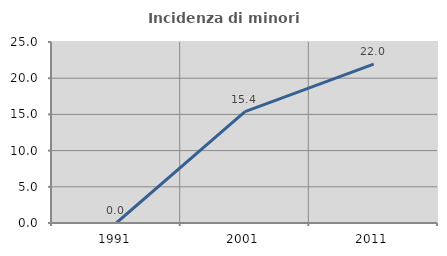
| Category | Incidenza di minori stranieri |
|---|---|
| 1991.0 | 0 |
| 2001.0 | 15.385 |
| 2011.0 | 21.951 |